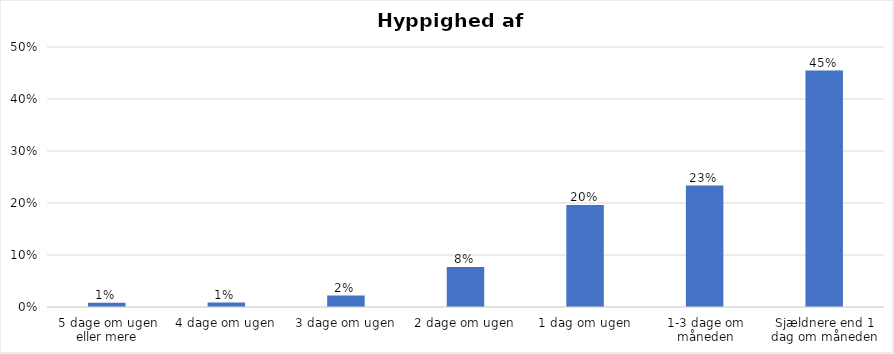
| Category | % |
|---|---|
| 5 dage om ugen eller mere | 0.008 |
| 4 dage om ugen | 0.009 |
| 3 dage om ugen | 0.022 |
| 2 dage om ugen | 0.077 |
| 1 dag om ugen | 0.196 |
| 1-3 dage om måneden | 0.234 |
| Sjældnere end 1 dag om måneden | 0.455 |